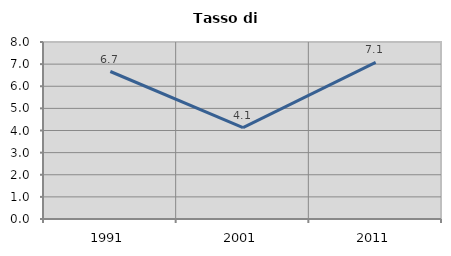
| Category | Tasso di disoccupazione   |
|---|---|
| 1991.0 | 6.667 |
| 2001.0 | 4.129 |
| 2011.0 | 7.078 |